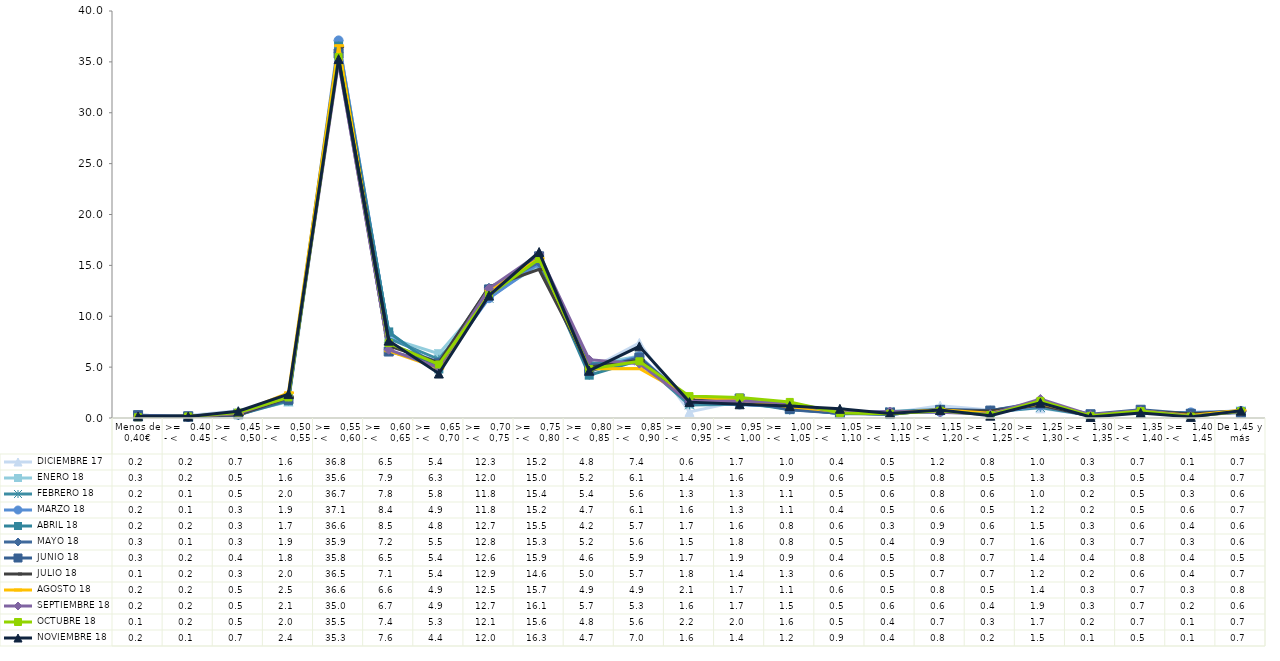
| Category |  DICIEMBRE 17 |  ENERO 18 |  FEBRERO 18 |  MARZO 18 |  ABRIL 18 |  MAYO 18 |  JUNIO 18 |  JULIO 18 |  AGOSTO 18 |  SEPTIEMBRE 18 |  OCTUBRE 18 |  NOVIEMBRE 18 |
|---|---|---|---|---|---|---|---|---|---|---|---|---|
| Menos de 0,40€ | 0.16 | 0.27 | 0.23 | 0.24 | 0.2 | 0.25 | 0.28 | 0.12 | 0.15 | 0.17 | 0.08 | 0.16 |
| >=   0.40 - <    0.45 | 0.24 | 0.17 | 0.08 | 0.1 | 0.16 | 0.11 | 0.17 | 0.22 | 0.15 | 0.15 | 0.15 | 0.14 |
| >=   0,45 - <    0,50 | 0.71 | 0.47 | 0.47 | 0.33 | 0.32 | 0.28 | 0.4 | 0.33 | 0.47 | 0.45 | 0.53 | 0.66 |
| >=   0,50 - <    0,55 | 1.63 | 1.59 | 1.95 | 1.9 | 1.69 | 1.94 | 1.81 | 2.02 | 2.48 | 2.09 | 2.02 | 2.35 |
| >=   0,55 - <    0,60 | 36.78 | 35.62 | 36.65 | 37.11 | 36.55 | 35.9 | 35.81 | 36.45 | 36.59 | 34.99 | 35.48 | 35.27 |
| >=   0,60 - <    0,65 | 6.53 | 7.87 | 7.82 | 8.37 | 8.46 | 7.24 | 6.54 | 7.09 | 6.6 | 6.71 | 7.36 | 7.6 |
| >=   0,65 - <   0,70 | 5.41 | 6.32 | 5.77 | 4.94 | 4.82 | 5.48 | 5.37 | 5.43 | 4.89 | 4.94 | 5.26 | 4.37 |
| >=   0,70 - <   0,75 | 12.31 | 12 | 11.76 | 11.77 | 12.66 | 12.8 | 12.63 | 12.87 | 12.53 | 12.72 | 12.06 | 12.03 |
| >=   0,75 - <   0,80 | 15.2 | 14.99 | 15.39 | 15.19 | 15.48 | 15.29 | 15.89 | 14.6 | 15.68 | 16.11 | 15.63 | 16.31 |
| >=   0,80 - <   0,85 | 4.77 | 5.21 | 5.36 | 4.73 | 4.21 | 5.24 | 4.61 | 5.02 | 4.85 | 5.73 | 4.81 | 4.65 |
| >=   0,85 - <   0,90 | 7.38 | 6.08 | 5.62 | 6.06 | 5.68 | 5.56 | 5.93 | 5.66 | 4.87 | 5.34 | 5.57 | 7.04 |
| >=   0,90 - <    0,95 | 0.6 | 1.37 | 1.29 | 1.62 | 1.67 | 1.52 | 1.71 | 1.79 | 2.1 | 1.62 | 2.15 | 1.56 |
| >=   0,95 - <   1,00 | 1.65 | 1.56 | 1.34 | 1.33 | 1.6 | 1.79 | 1.92 | 1.43 | 1.74 | 1.68 | 2.01 | 1.35 |
| >=   1,00 - <   1,05 | 0.95 | 0.9 | 1.06 | 1.09 | 0.82 | 0.81 | 0.91 | 1.3 | 1.1 | 1.47 | 1.58 | 1.18 |
| >=   1,05 - <    1,10 | 0.44 | 0.57 | 0.46 | 0.4 | 0.55 | 0.46 | 0.44 | 0.63 | 0.64 | 0.52 | 0.5 | 0.9 |
| >=   1,10 - <   1,15 | 0.49 | 0.51 | 0.64 | 0.52 | 0.34 | 0.35 | 0.54 | 0.45 | 0.48 | 0.64 | 0.42 | 0.44 |
| >=   1,15 - <    1,20 | 1.21 | 0.8 | 0.83 | 0.6 | 0.85 | 0.86 | 0.78 | 0.7 | 0.82 | 0.57 | 0.71 | 0.79 |
| >=   1,20 - <    1,25 | 0.79 | 0.52 | 0.57 | 0.45 | 0.55 | 0.71 | 0.73 | 0.69 | 0.46 | 0.38 | 0.3 | 0.23 |
| >=   1,25 - <    1,30 | 0.95 | 1.3 | 1.04 | 1.23 | 1.47 | 1.56 | 1.42 | 1.24 | 1.43 | 1.87 | 1.68 | 1.5 |
| >=   1,30 - <    1,35 | 0.28 | 0.3 | 0.24 | 0.21 | 0.26 | 0.28 | 0.37 | 0.2 | 0.28 | 0.31 | 0.21 | 0.1 |
| >=   1,35 - <    1,40 | 0.74 | 0.51 | 0.51 | 0.54 | 0.64 | 0.67 | 0.81 | 0.63 | 0.68 | 0.73 | 0.68 | 0.5 |
| >=   1,40 - <    1,45 | 0.13 | 0.37 | 0.32 | 0.55 | 0.42 | 0.31 | 0.42 | 0.43 | 0.25 | 0.18 | 0.14 | 0.11 |
| De 1,45 y más | 0.66 | 0.68 | 0.59 | 0.7 | 0.59 | 0.59 | 0.51 | 0.68 | 0.76 | 0.61 | 0.67 | 0.72 |